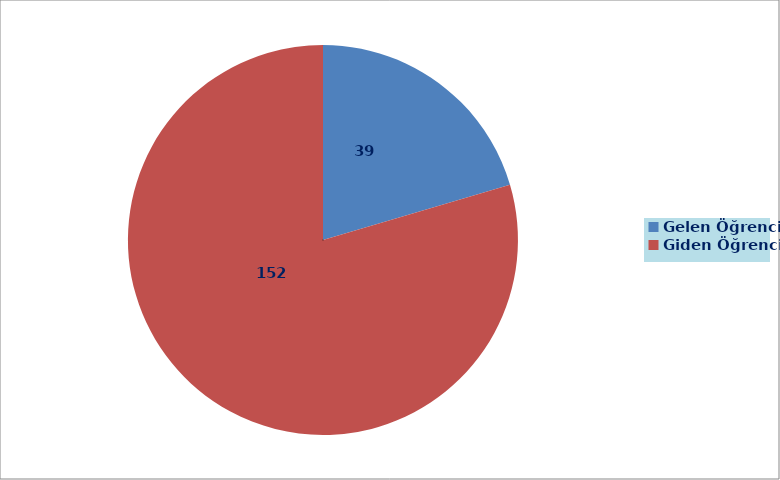
| Category | Series 0 |
|---|---|
| Gelen Öğrenci | 39 |
| Giden Öğrenci | 152 |